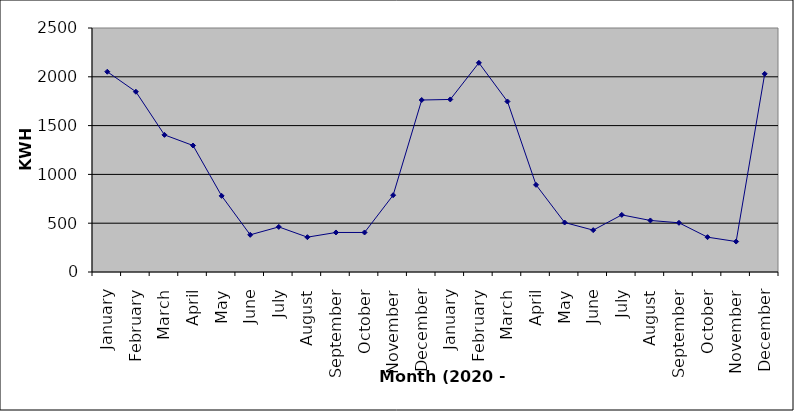
| Category | Series 0 |
|---|---|
| January | 2052 |
| February | 1847 |
| March | 1405 |
| April | 1296 |
| May | 780 |
| June | 381 |
| July | 462 |
| August | 357 |
| September | 405 |
| October | 405 |
| November | 787 |
| December | 1762 |
| January | 1768 |
| February | 2143 |
| March | 1747 |
| April | 893 |
| May | 507 |
| June | 429 |
| July | 585 |
| August | 528 |
| September | 504 |
| October | 357 |
| November | 312 |
| December | 2030 |